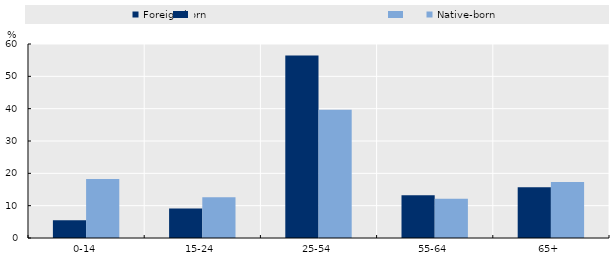
| Category | Foreign-born | Native-born |
|---|---|---|
| 0-14 | 5.485 | 18.254 |
| 15-24 | 9.137 | 12.596 |
| 25-54 | 56.433 | 39.685 |
| 55-64 | 13.222 | 12.174 |
| 65+ | 15.724 | 17.29 |